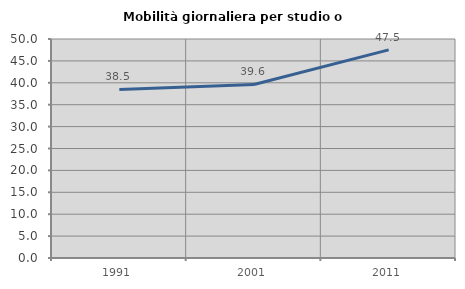
| Category | Mobilità giornaliera per studio o lavoro |
|---|---|
| 1991.0 | 38.499 |
| 2001.0 | 39.619 |
| 2011.0 | 47.509 |